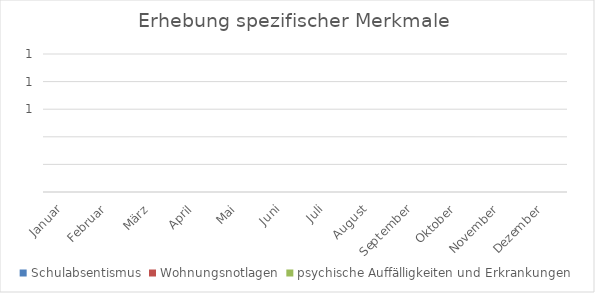
| Category | Schulabsentismus | Wohnungsnotlagen | psychische Auffälligkeiten und Erkrankungen |
|---|---|---|---|
| Januar | 0 | 0 | 0 |
| Februar | 0 | 0 | 0 |
| März | 0 | 0 | 0 |
| April | 0 | 0 | 0 |
| Mai | 0 | 0 | 0 |
| Juni | 0 | 0 | 0 |
| Juli | 0 | 0 | 0 |
| August | 0 | 0 | 0 |
| September | 0 | 0 | 0 |
| Oktober | 0 | 0 | 0 |
| November | 0 | 0 | 0 |
| Dezember | 0 | 0 | 0 |